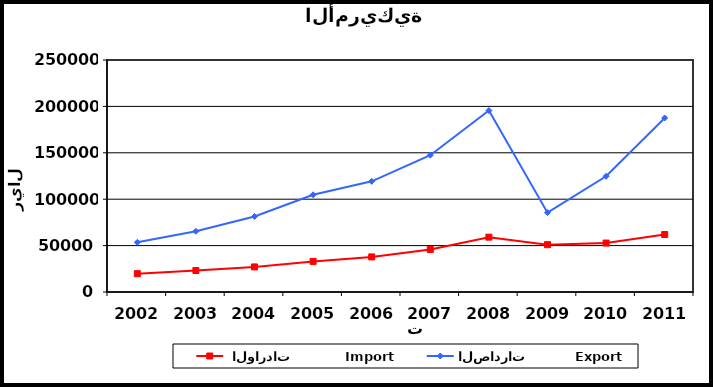
| Category |  الواردات           Import | الصادرات          Export |
|---|---|---|
| 2002.0 | 19737 | 53511 |
| 2003.0 | 23150 | 65385 |
| 2004.0 | 27028 | 81360 |
| 2005.0 | 32952 | 104746 |
| 2006.0 | 37802 | 119239 |
| 2007.0 | 45852 | 147432 |
| 2008.0 | 59107 | 195521 |
| 2009.0 | 50999 | 85532 |
| 2010.0 | 52749 | 124675 |
| 2011.0 | 61943 | 187522 |